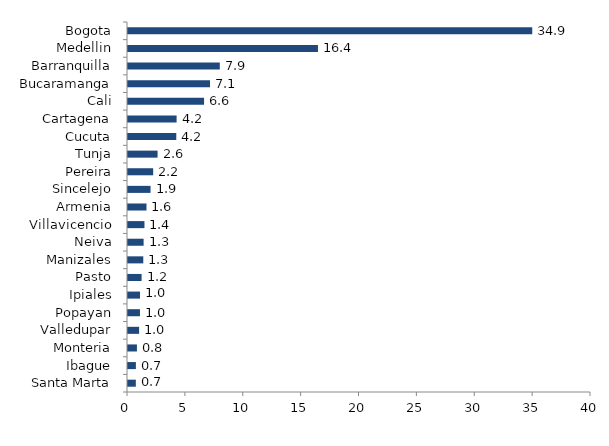
| Category | Series 0 |
|---|---|
| Santa Marta | 0.677 |
| Ibague | 0.681 |
| Monteria | 0.772 |
| Valledupar | 0.96 |
| Popayan | 1.034 |
| Ipiales | 1.036 |
| Pasto | 1.175 |
| Manizales | 1.32 |
| Neiva | 1.35 |
| Villavicencio | 1.422 |
| Armenia | 1.597 |
| Sincelejo | 1.948 |
| Pereira | 2.176 |
| Tunja | 2.555 |
| Cucuta | 4.171 |
| Cartagena | 4.2 |
| Cali | 6.572 |
| Bucaramanga | 7.085 |
| Barranquilla | 7.931 |
| Medellin | 16.412 |
| Bogota | 34.925 |